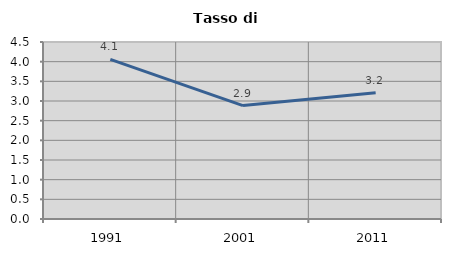
| Category | Tasso di disoccupazione   |
|---|---|
| 1991.0 | 4.057 |
| 2001.0 | 2.883 |
| 2011.0 | 3.211 |